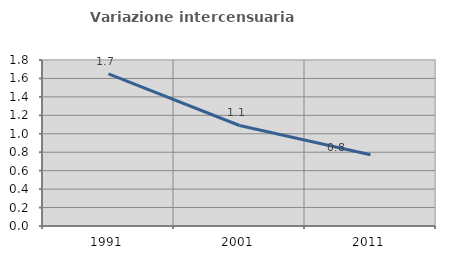
| Category | Variazione intercensuaria annua |
|---|---|
| 1991.0 | 1.65 |
| 2001.0 | 1.09 |
| 2011.0 | 0.772 |